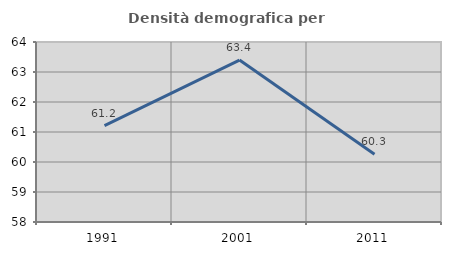
| Category | Densità demografica |
|---|---|
| 1991.0 | 61.216 |
| 2001.0 | 63.399 |
| 2011.0 | 60.255 |